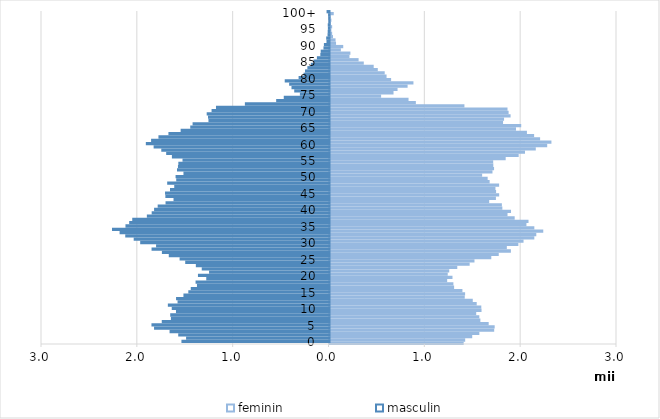
| Category | feminin | masculin |
|---|---|---|
| 0 | 13896 | -15345 |
| 1 | 14054 | -14861 |
| 2 | 14788 | -15681 |
| 3 | 15533 | -16584 |
| 4 | 17080 | -18204 |
| 5 | 17132 | -18473 |
| 6 | 16506 | -17399 |
| 7 | 15639 | -16445 |
| 8 | 15529 | -16517 |
| 9 | 15204 | -15917 |
| 10 | 15759 | -16357 |
| 11 | 15735 | -16763 |
| 12 | 15256 | -15752 |
| 13 | 14845 | -15907 |
| 14 | 14009 | -15137 |
| 15 | 14046 | -14628 |
| 16 | 13766 | -14373 |
| 17 | 12899 | -13727 |
| 18 | 12823 | -13871 |
| 19 | 12174 | -12756 |
| 20 | 12728 | -13622 |
| 21 | 12233 | -12463 |
| 22 | 12390 | -13227 |
| 23 | 13229 | -13842 |
| 24 | 14521 | -14951 |
| 25 | 15024 | -15538 |
| 26 | 16778 | -16666 |
| 27 | 17557 | -17385 |
| 28 | 18824 | -18464 |
| 29 | 18401 | -17992 |
| 30 | 19603 | -19650 |
| 31 | 20143 | -20328 |
| 32 | 21269 | -21209 |
| 33 | 21475 | -21798 |
| 34 | 22201 | -22592 |
| 35 | 21270 | -21186 |
| 36 | 20446 | -20799 |
| 37 | 20662 | -20479 |
| 38 | 19219 | -18955 |
| 39 | 18472 | -18451 |
| 40 | 18836 | -18200 |
| 41 | 17933 | -17825 |
| 42 | 17882 | -17005 |
| 43 | 16560 | -16172 |
| 44 | 17261 | -17023 |
| 45 | 17600 | -17057 |
| 46 | 17278 | -16539 |
| 47 | 17213 | -16098 |
| 48 | 17596 | -16833 |
| 49 | 16606 | -15890 |
| 50 | 16399 | -15958 |
| 51 | 15823 | -15136 |
| 52 | 16901 | -15808 |
| 53 | 17067 | -15709 |
| 54 | 16989 | -15669 |
| 55 | 16975 | -15235 |
| 56 | 18280 | -16342 |
| 57 | 19636 | -16938 |
| 58 | 20296 | -17448 |
| 59 | 21421 | -18248 |
| 60 | 22612 | -19061 |
| 61 | 23053 | -18512 |
| 62 | 21872 | -17745 |
| 63 | 21248 | -16703 |
| 64 | 20497 | -15430 |
| 65 | 19356 | -14426 |
| 66 | 19901 | -14182 |
| 67 | 18005 | -12526 |
| 68 | 18109 | -12572 |
| 69 | 18792 | -12710 |
| 70 | 18586 | -12202 |
| 71 | 18470 | -11741 |
| 72 | 13975 | -8726 |
| 73 | 8907 | -5461 |
| 74 | 8144 | -4668 |
| 75 | 5281 | -2986 |
| 76 | 6577 | -3576 |
| 77 | 6997 | -3862 |
| 78 | 8046 | -4106 |
| 79 | 8654 | -4567 |
| 80 | 6324 | -3121 |
| 81 | 5850 | -2603 |
| 82 | 5657 | -2450 |
| 83 | 4934 | -2204 |
| 84 | 4507 | -1847 |
| 85 | 3473.775 | -1560.448 |
| 86 | 2931.493 | -1209.556 |
| 87 | 1978.591 | -853.8 |
| 88 | 2075.939 | -812.631 |
| 89 | 1080.48 | -526 |
| 90 | 1328.802 | -480.769 |
| 91 | 577.556 | -211.869 |
| 92 | 527 | -240.041 |
| 93 | 262.691 | -100 |
| 94 | 172.38 | -85 |
| 95 | 91 | -65.077 |
| 96 | 172.243 | -77.638 |
| 97 | 47.727 | -4 |
| 98 | 91.667 | -21.621 |
| 99 | 27.844 | -39.918 |
| 100+ | 338.52 | -202.923 |